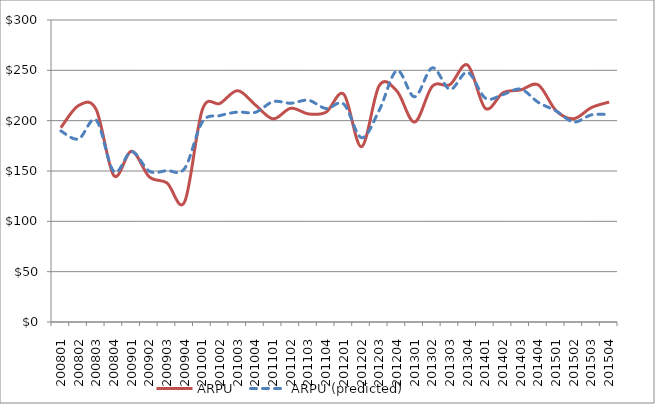
| Category | ARPU | ARPU (predicted) |
|---|---|---|
| 200801.0 | 193.009 | 189.795 |
| 200802.0 | 215.024 | 181.817 |
| 200803.0 | 210.93 | 200.541 |
| 200804.0 | 145.396 | 149.354 |
| 200901.0 | 169.661 | 169.277 |
| 200902.0 | 144.19 | 149.81 |
| 200903.0 | 138.154 | 150.389 |
| 200904.0 | 119.425 | 152.562 |
| 201001.0 | 210.993 | 198.787 |
| 201002.0 | 217.159 | 205.074 |
| 201003.0 | 229.789 | 208.531 |
| 201004.0 | 215.59 | 208.27 |
| 201101.0 | 201.8 | 218.871 |
| 201102.0 | 212.329 | 217.345 |
| 201103.0 | 206.692 | 220.234 |
| 201104.0 | 208.502 | 212.042 |
| 201201.0 | 226.185 | 216.427 |
| 201202.0 | 174.082 | 183.055 |
| 201203.0 | 234.809 | 210.291 |
| 201204.0 | 229.409 | 249.694 |
| 201301.0 | 198.648 | 223.684 |
| 201302.0 | 234.175 | 252.461 |
| 201303.0 | 235.828 | 231.12 |
| 201304.0 | 255.225 | 248.017 |
| 201401.0 | 212.256 | 222.399 |
| 201402.0 | 227.704 | 225.941 |
| 201403.0 | 230.553 | 231.29 |
| 201404.0 | 235.435 | 218.08 |
| 201501.0 | 209.872 | 209.648 |
| 201502.0 | 201.962 | 198.674 |
| 201503.0 | 213.04 | 205.776 |
| 201504.0 | 218.475 | 206.06 |